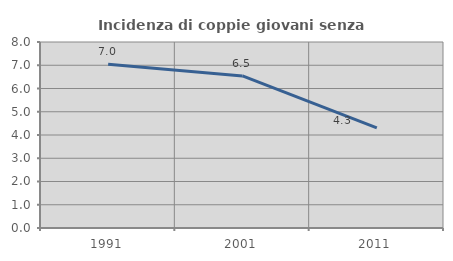
| Category | Incidenza di coppie giovani senza figli |
|---|---|
| 1991.0 | 7.04 |
| 2001.0 | 6.54 |
| 2011.0 | 4.304 |